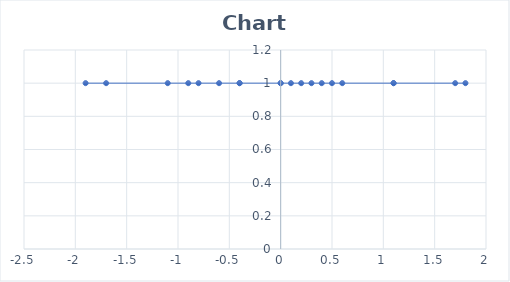
| Category | Series 0 |
|---|---|
| -1.9 | 1 |
| -1.7 | 1 |
| -1.1 | 1 |
| -0.9 | 1 |
| -0.8 | 1 |
| -0.6 | 1 |
| -0.4 | 1 |
| -0.4 | 1 |
| 0.0 | 1 |
| 0.0 | 1 |
| 0.1 | 1 |
| 0.2 | 1 |
| 0.3 | 1 |
| 0.4 | 1 |
| 0.5 | 1 |
| 0.6 | 1 |
| 1.1 | 1 |
| 1.1 | 1 |
| 1.7 | 1 |
| 1.8 | 1 |